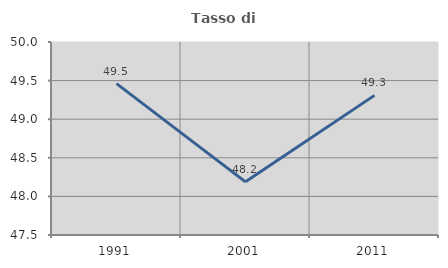
| Category | Tasso di occupazione   |
|---|---|
| 1991.0 | 49.461 |
| 2001.0 | 48.188 |
| 2011.0 | 49.309 |